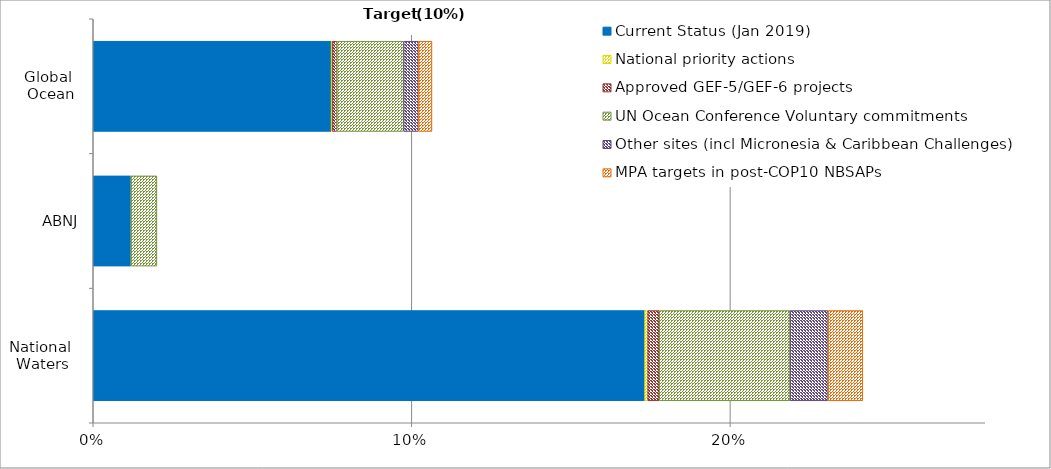
| Category | Current Status (Jan 2019) | National priority actions | Approved GEF-5/GEF-6 projects  | UN Ocean Conference Voluntary commitments  | Other sites (incl Micronesia & Caribbean Challenges) | MPA targets in post-COP10 NBSAPs |
|---|---|---|---|---|---|---|
| National 
Waters | 0.173 | 0.001 | 0.004 | 0.041 | 0.012 | 0.011 |
| ABNJ | 0.012 | 0 | 0 | 0.008 | 0 | 0 |
| Global 
Ocean | 0.075 | 0 | 0.001 | 0.021 | 0.005 | 0.004 |